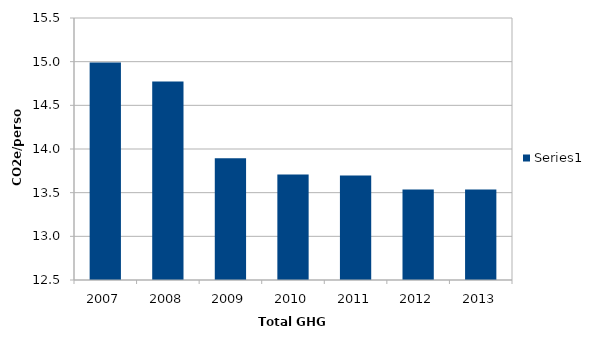
| Category | Series 0 |
|---|---|
| 2007 | 14.989 |
| 2008 | 14.773 |
| 2009 | 13.893 |
| 2010 | 13.707 |
| 2011 | 13.695 |
| 2012 | 13.536 |
| 2013 | 13.536 |